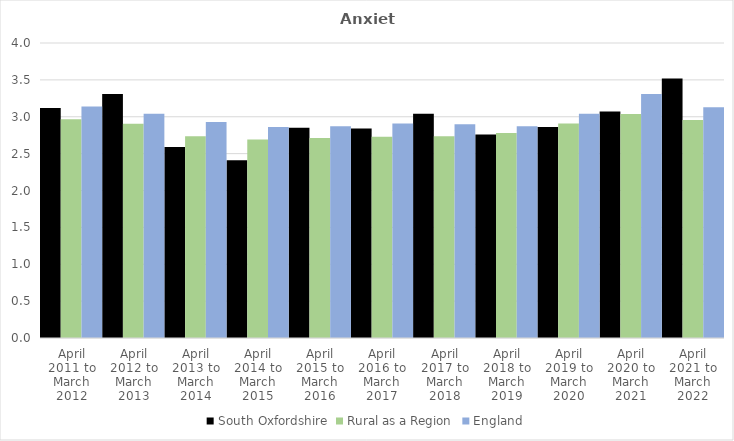
| Category | South Oxfordshire | Rural as a Region | England |
|---|---|---|---|
| April 2011 to March 2012 | 3.12 | 2.967 | 3.14 |
| April 2012 to March 2013 | 3.31 | 2.904 | 3.04 |
| April 2013 to March 2014 | 2.59 | 2.734 | 2.93 |
| April 2014 to March 2015 | 2.41 | 2.691 | 2.86 |
| April 2015 to March 2016 | 2.85 | 2.711 | 2.87 |
| April 2016 to March 2017 | 2.84 | 2.729 | 2.91 |
| April 2017 to March 2018 | 3.04 | 2.736 | 2.9 |
| April 2018 to March 2019 | 2.76 | 2.78 | 2.87 |
| April 2019 to March 2020 | 2.86 | 2.908 | 3.04 |
| April 2020 to March 2021 | 3.07 | 3.036 | 3.31 |
| April 2021 to March 2022 | 3.52 | 2.956 | 3.13 |